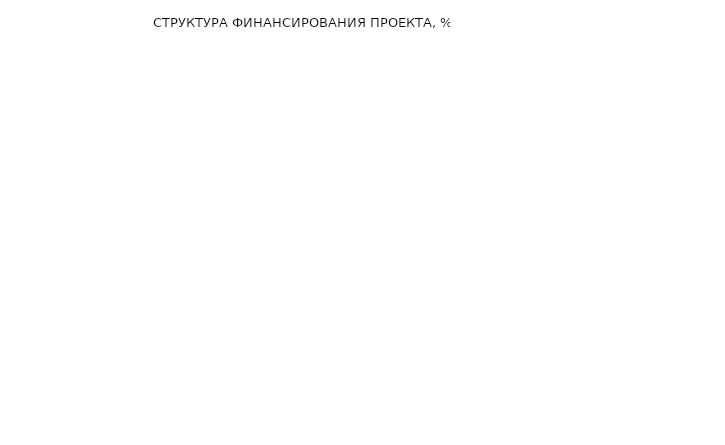
| Category | Series 0 |
|---|---|
|   Собственные средства | 0 |
|   Заемные средства (кредиты) | 0 |
|   Государственные субсидии (МРПиП МО) | 0 |
|   Государственные субсидии (ГСЗН) | 0 |
|   Субвенция (ГСЗН) | 0 |
|   Прочие источники финансирования | 0 |